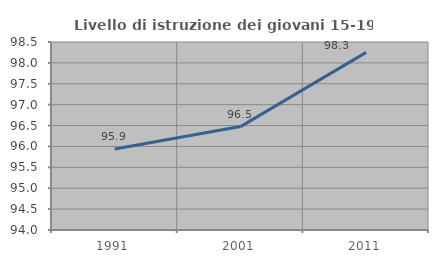
| Category | Livello di istruzione dei giovani 15-19 anni |
|---|---|
| 1991.0 | 95.94 |
| 2001.0 | 96.475 |
| 2011.0 | 98.252 |